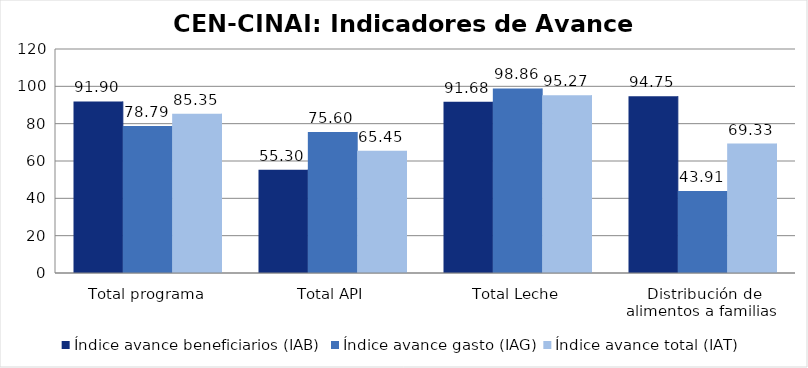
| Category | Índice avance beneficiarios (IAB)  | Índice avance gasto (IAG) | Índice avance total (IAT)  |
|---|---|---|---|
| Total programa | 91.905 | 78.79 | 85.347 |
| Total API | 55.3 | 75.595 | 65.448 |
| Total Leche | 91.679 | 98.856 | 95.268 |
| Distribución de alimentos a familias  | 94.747 | 43.915 | 69.331 |